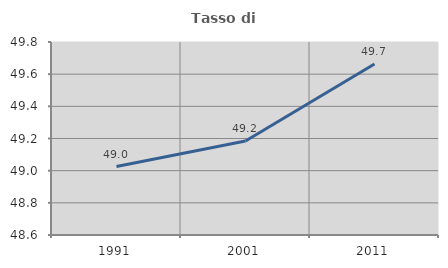
| Category | Tasso di occupazione   |
|---|---|
| 1991.0 | 49.026 |
| 2001.0 | 49.185 |
| 2011.0 | 49.664 |